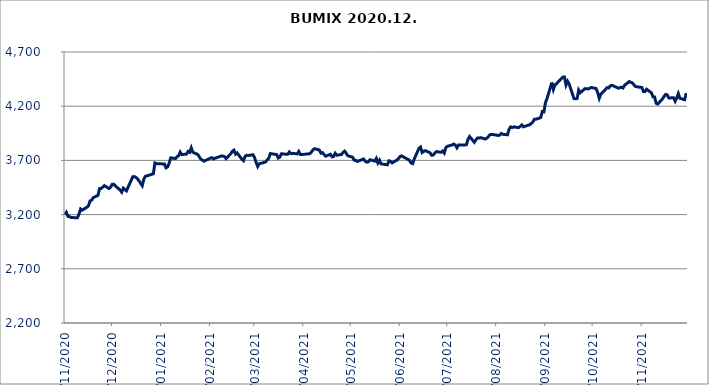
| Category | BUMIX |
|---|---|
| 02/11/2020 | 3200.25 |
| 03/11/2020 | 3220.92 |
| 04/11/2020 | 3183.95 |
| 05/11/2020 | 3181.86 |
| 06/11/2020 | 3172.91 |
| 09/11/2020 | 3171.47 |
| 10/11/2020 | 3171.23 |
| 11/11/2020 | 3204.99 |
| 12/11/2020 | 3252 |
| 13/11/2020 | 3240.74 |
| 16/11/2020 | 3268.32 |
| 17/11/2020 | 3282.14 |
| 18/11/2020 | 3326.62 |
| 19/11/2020 | 3333.37 |
| 20/11/2020 | 3356.65 |
| 23/11/2020 | 3377.82 |
| 24/11/2020 | 3439.84 |
| 25/11/2020 | 3441.29 |
| 26/11/2020 | 3453.36 |
| 27/11/2020 | 3467.59 |
| 30/11/2020 | 3440.21 |
| 01/12/2020 | 3454.61 |
| 02/12/2020 | 3479.14 |
| 03/12/2020 | 3479.7 |
| 04/12/2020 | 3463.96 |
| 07/12/2020 | 3426.71 |
| 08/12/2020 | 3406.79 |
| 09/12/2020 | 3444.12 |
| 10/12/2020 | 3431.99 |
| 11/12/2020 | 3418.86 |
| 14/12/2020 | 3517.03 |
| 15/12/2020 | 3549.02 |
| 16/12/2020 | 3550.69 |
| 17/12/2020 | 3543.31 |
| 18/12/2020 | 3530.03 |
| 21/12/2020 | 3466.56 |
| 22/12/2020 | 3528.93 |
| 23/12/2020 | 3553 |
| 28/12/2020 | 3576.63 |
| 29/12/2020 | 3676.15 |
| 30/12/2020 | 3670.042 |
| 04/01/2021 | 3666.94 |
| 05/01/2021 | 3631.47 |
| 06/01/2021 | 3639.83 |
| 07/01/2021 | 3673.66 |
| 08/01/2021 | 3723.52 |
| 11/01/2021 | 3717.11 |
| 12/01/2021 | 3733.93 |
| 13/01/2021 | 3743.66 |
| 14/01/2021 | 3776.42 |
| 15/01/2021 | 3753.13 |
| 18/01/2021 | 3758.69 |
| 19/01/2021 | 3783.21 |
| 20/01/2021 | 3774.08 |
| 21/01/2021 | 3816.27 |
| 22/01/2021 | 3774.64 |
| 25/01/2021 | 3755.75 |
| 26/01/2021 | 3735.14 |
| 27/01/2021 | 3711.23 |
| 28/01/2021 | 3703.47 |
| 29/01/2021 | 3692.35 |
| 01/02/2021 | 3713.3 |
| 02/02/2021 | 3721.16 |
| 03/02/2021 | 3725.78 |
| 04/02/2021 | 3713.5 |
| 05/02/2021 | 3720.14 |
| 08/02/2021 | 3735.17 |
| 09/02/2021 | 3741.05 |
| 10/02/2021 | 3739.45 |
| 11/02/2021 | 3735 |
| 12/02/2021 | 3716.17 |
| 15/02/2021 | 3761.64 |
| 16/02/2021 | 3784.64 |
| 17/02/2021 | 3794.47 |
| 18/02/2021 | 3757.86 |
| 19/02/2021 | 3768.62 |
| 22/02/2021 | 3711.29 |
| 23/02/2021 | 3696.27 |
| 24/02/2021 | 3736.18 |
| 25/02/2021 | 3747.99 |
| 26/02/2021 | 3744.67 |
| 01/03/2021 | 3752.44 |
| 02/03/2021 | 3726.66 |
| 03/03/2021 | 3680.33 |
| 04/03/2021 | 3643.62 |
| 05/03/2021 | 3669.15 |
| 08/03/2021 | 3680.69 |
| 09/03/2021 | 3686.14 |
| 10/03/2021 | 3703.66 |
| 11/03/2021 | 3720.43 |
| 12/03/2021 | 3762.99 |
| 16/03/2021 | 3753.85 |
| 17/03/2021 | 3722.11 |
| 18/03/2021 | 3730.13 |
| 19/03/2021 | 3761.3 |
| 22/03/2021 | 3756.8 |
| 23/03/2021 | 3756.18 |
| 24/03/2021 | 3778.02 |
| 25/03/2021 | 3762.1 |
| 26/03/2021 | 3765.17 |
| 29/03/2021 | 3760.12 |
| 30/03/2021 | 3782.9 |
| 31/03/2021 | 3754.86 |
| 01/04/2021 | 3754.04 |
| 06/04/2021 | 3761.95 |
| 07/04/2021 | 3777.27 |
| 08/04/2021 | 3798.2 |
| 09/04/2021 | 3808.26 |
| 12/04/2021 | 3795.78 |
| 13/04/2021 | 3766.75 |
| 14/04/2021 | 3771.86 |
| 15/04/2021 | 3753.41 |
| 16/04/2021 | 3738.77 |
| 19/04/2021 | 3756.43 |
| 20/04/2021 | 3732.67 |
| 21/04/2021 | 3736.16 |
| 22/04/2021 | 3766.06 |
| 23/04/2021 | 3747.88 |
| 26/04/2021 | 3754.41 |
| 27/04/2021 | 3774.04 |
| 28/04/2021 | 3785.46 |
| 29/04/2021 | 3764.89 |
| 30/04/2021 | 3742.28 |
| 03/05/2021 | 3730.11 |
| 04/05/2021 | 3702.37 |
| 05/05/2021 | 3700.76 |
| 06/05/2021 | 3690.24 |
| 07/05/2021 | 3696.3 |
| 10/05/2021 | 3712.94 |
| 11/05/2021 | 3692.08 |
| 12/05/2021 | 3683.66 |
| 13/05/2021 | 3686.36 |
| 14/05/2021 | 3706.54 |
| 17/05/2021 | 3693.36 |
| 18/05/2021 | 3718.14 |
| 19/05/2021 | 3676.61 |
| 20/05/2021 | 3701.45 |
| 21/05/2021 | 3667.93 |
| 25/05/2021 | 3659.42 |
| 26/05/2021 | 3695.97 |
| 27/05/2021 | 3691.66 |
| 28/05/2021 | 3676.84 |
| 31/05/2021 | 3702.72 |
| 01/06/2021 | 3715.57 |
| 02/06/2021 | 3735.73 |
| 03/06/2021 | 3741.61 |
| 04/06/2021 | 3733.15 |
| 07/06/2021 | 3709.46 |
| 08/06/2021 | 3700.79 |
| 09/06/2021 | 3676.16 |
| 10/06/2021 | 3670.48 |
| 11/06/2021 | 3712.42 |
| 14/06/2021 | 3812.06 |
| 15/06/2021 | 3823.15 |
| 16/06/2021 | 3772.74 |
| 17/06/2021 | 3784 |
| 18/06/2021 | 3789.98 |
| 21/06/2021 | 3770.52 |
| 22/06/2021 | 3747.49 |
| 23/06/2021 | 3749.3 |
| 24/06/2021 | 3767.66 |
| 25/06/2021 | 3781.28 |
| 28/06/2021 | 3774.78 |
| 29/06/2021 | 3786.58 |
| 30/06/2021 | 3767.61 |
| 01/07/2021 | 3818.34 |
| 02/07/2021 | 3830.52 |
| 05/07/2021 | 3842.74 |
| 06/07/2021 | 3850.72 |
| 07/07/2021 | 3840.93 |
| 08/07/2021 | 3816.21 |
| 09/07/2021 | 3841.96 |
| 12/07/2021 | 3842.91 |
| 13/07/2021 | 3842.17 |
| 14/07/2021 | 3844.48 |
| 15/07/2021 | 3893.9 |
| 16/07/2021 | 3920.28 |
| 19/07/2021 | 3867.14 |
| 20/07/2021 | 3890.16 |
| 21/07/2021 | 3906.3 |
| 22/07/2021 | 3905.88 |
| 23/07/2021 | 3910.05 |
| 26/07/2021 | 3897.02 |
| 27/07/2021 | 3907.07 |
| 28/07/2021 | 3922 |
| 29/07/2021 | 3937.81 |
| 30/07/2021 | 3939.4 |
| 02/08/2021 | 3934.13 |
| 03/08/2021 | 3929.12 |
| 04/08/2021 | 3933.57 |
| 05/08/2021 | 3948.67 |
| 06/08/2021 | 3940.84 |
| 09/08/2021 | 3936.39 |
| 10/08/2021 | 3988.56 |
| 11/08/2021 | 4008.96 |
| 12/08/2021 | 4002.87 |
| 13/08/2021 | 4009.14 |
| 16/08/2021 | 4002.18 |
| 17/08/2021 | 4013.31 |
| 18/08/2021 | 4027.31 |
| 19/08/2021 | 4009.73 |
| 23/08/2021 | 4029.07 |
| 24/08/2021 | 4041.06 |
| 25/08/2021 | 4053.57 |
| 26/08/2021 | 4080.45 |
| 27/08/2021 | 4079.53 |
| 30/08/2021 | 4095.22 |
| 31/08/2021 | 4151.22 |
| 01/09/2021 | 4147.64 |
| 02/09/2021 | 4233.18 |
| 03/09/2021 | 4271.59 |
| 06/09/2021 | 4417.57 |
| 07/09/2021 | 4354.49 |
| 08/09/2021 | 4395.86 |
| 09/09/2021 | 4407.76 |
| 10/09/2021 | 4424.38 |
| 13/09/2021 | 4468.47 |
| 14/09/2021 | 4468.74 |
| 15/09/2021 | 4395.2 |
| 16/09/2021 | 4429.91 |
| 17/09/2021 | 4404.2 |
| 20/09/2021 | 4270.78 |
| 21/09/2021 | 4268.42 |
| 22/09/2021 | 4270.89 |
| 23/09/2021 | 4349.07 |
| 24/09/2021 | 4324.31 |
| 27/09/2021 | 4362.09 |
| 28/09/2021 | 4360.92 |
| 29/09/2021 | 4358.99 |
| 30/09/2021 | 4365.64 |
| 01/10/2021 | 4372.74 |
| 04/10/2021 | 4362.94 |
| 05/10/2021 | 4326.82 |
| 06/10/2021 | 4273.07 |
| 07/10/2021 | 4310.14 |
| 08/10/2021 | 4325.13 |
| 11/10/2021 | 4371.07 |
| 12/10/2021 | 4368.19 |
| 13/10/2021 | 4388.26 |
| 14/10/2021 | 4392.24 |
| 15/10/2021 | 4387.15 |
| 18/10/2021 | 4366.68 |
| 19/10/2021 | 4370.65 |
| 20/10/2021 | 4375.2 |
| 21/10/2021 | 4367.75 |
| 22/10/2021 | 4392.46 |
| 25/10/2021 | 4428.31 |
| 26/10/2021 | 4419.51 |
| 27/10/2021 | 4414.15 |
| 28/10/2021 | 4396.35 |
| 29/10/2021 | 4381.14 |
| 02/11/2021 | 4371.95 |
| 03/11/2021 | 4334.22 |
| 04/11/2021 | 4335.89 |
| 05/11/2021 | 4356.33 |
| 08/11/2021 | 4323.72 |
| 09/11/2021 | 4286.95 |
| 10/11/2021 | 4285.37 |
| 11/11/2021 | 4226.99 |
| 12/11/2021 | 4219.97 |
| 15/11/2021 | 4267.57 |
| 16/11/2021 | 4290.72 |
| 17/11/2021 | 4308.88 |
| 18/11/2021 | 4305.32 |
| 19/11/2021 | 4275.83 |
| 22/11/2021 | 4277.83 |
| 23/11/2021 | 4245.77 |
| 24/11/2021 | 4275.81 |
| 25/11/2021 | 4316.18 |
| 26/11/2021 | 4273.42 |
| 29/11/2021 | 4260.04 |
| 30/11/2021 | 4320.18 |